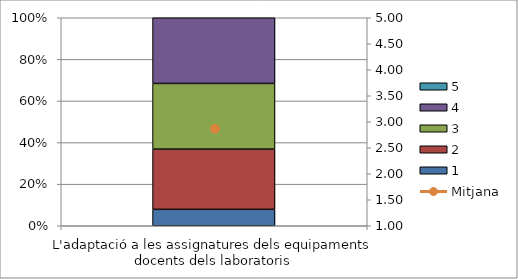
| Category | 1 | 2 | 3 | 4 | 5 |
|---|---|---|---|---|---|
| L'adaptació a les assignatures dels equipaments docents dels laboratoris | 3 | 11 | 12 | 12 | 0 |